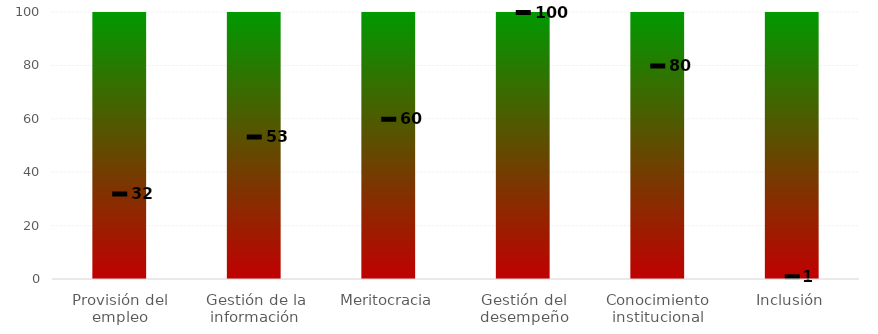
| Category | Niveles |
|---|---|
| Provisión del empleo | 100 |
| Gestión de la información | 100 |
| Meritocracia | 100 |
| Gestión del desempeño | 100 |
| Conocimiento institucional | 100 |
| Inclusión | 100 |